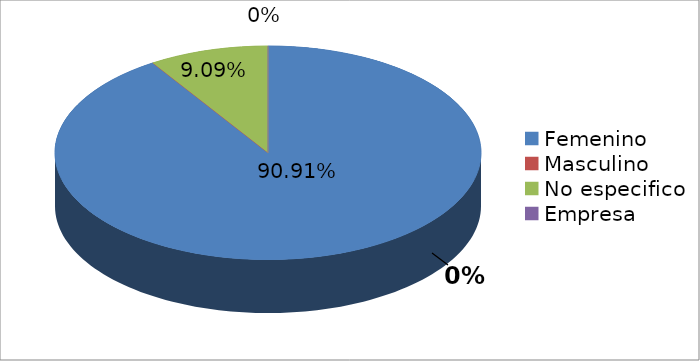
| Category | Series 0 |
|---|---|
| Femenino | 10 |
| Masculino | 0 |
| No especifico | 1 |
| Empresa | 0 |